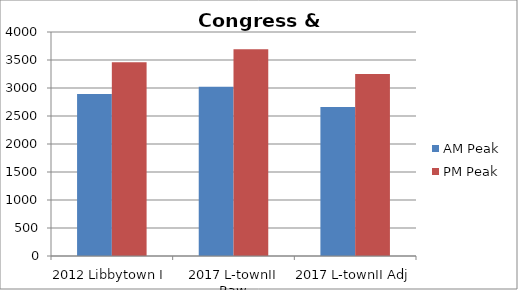
| Category | AM Peak | PM Peak |
|---|---|---|
| 2012 Libbytown I | 2892 | 3461 |
| 2017 L-townII Raw | 3024 | 3693 |
| 2017 L-townII Adj | 2661 | 3250 |